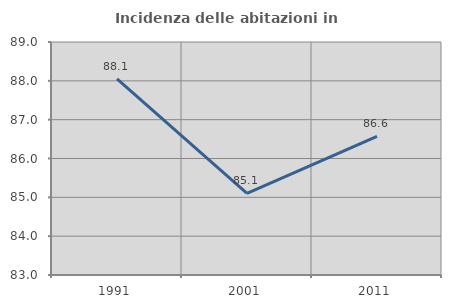
| Category | Incidenza delle abitazioni in proprietà  |
|---|---|
| 1991.0 | 88.051 |
| 2001.0 | 85.103 |
| 2011.0 | 86.567 |